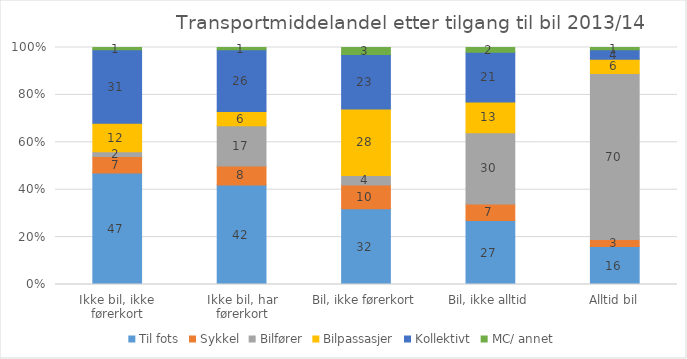
| Category | Til fots | Sykkel | Bilfører | Bilpassasjer | Kollektivt | MC/ annet |
|---|---|---|---|---|---|---|
| Ikke bil, ikke førerkort | 47 | 7 | 2 | 12 | 31 | 1 |
| Ikke bil, har førerkort | 42 | 8 | 17 | 6 | 26 | 1 |
| Bil, ikke førerkort | 32 | 10 | 4 | 28 | 23 | 3 |
| Bil, ikke alltid | 27 | 7 | 30 | 13 | 21 | 2 |
| Alltid bil | 16 | 3 | 70 | 6 | 4 | 1 |